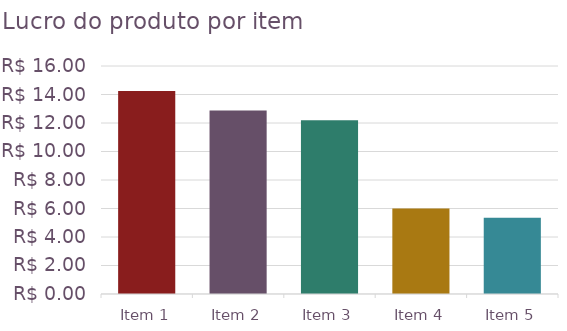
| Category | Lucro por item 
(inclusive remessa) |
|---|---|
| Item 1 | 14.25 |
| Item 2 | 12.875 |
| Item 3 | 12.2 |
| Item 4 | 6 |
| Item 5 | 5.35 |